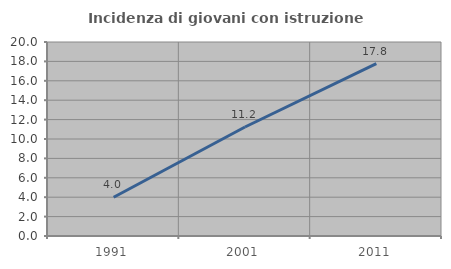
| Category | Incidenza di giovani con istruzione universitaria |
|---|---|
| 1991.0 | 4 |
| 2001.0 | 11.236 |
| 2011.0 | 17.778 |